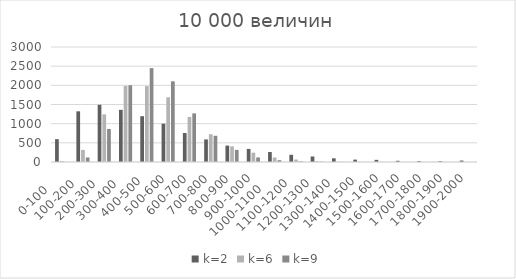
| Category | k=2 | k=6 | k=9 |
|---|---|---|---|
| 0-100     | 596 | 25 | 2 |
| 100-200   | 1322 | 315 | 118 |
| 200-300   | 1492 | 1243 | 862 |
| 300-400   | 1361 | 1985 | 2002 |
| 400-500  | 1195 | 1980 | 2449 |
| 500-600 | 1000 | 1687 | 2105 |
| 600-700 | 756 | 1175 | 1269 |
| 700-800 | 589 | 724 | 684 |
| 800-900 | 428 | 407 | 316 |
| 900-1000 | 341 | 243 | 119 |
| 1000-1100     | 260 | 118 | 47 |
| 1100-1200   | 188 | 64 | 16 |
| 1200-1300   | 144 | 19 | 9 |
| 1300-1400   | 96 | 7 | 2 |
| 1400-1500  | 62 | 5 | 0 |
| 1500-1600 | 56 | 2 | 0 |
| 1600-1700 | 32 | 1 | 0 |
| 1700-1800 | 24 | 0 | 0 |
| 1800-1900 | 20 | 0 | 0 |
| 1900-2000 | 38 | 0 | 0 |